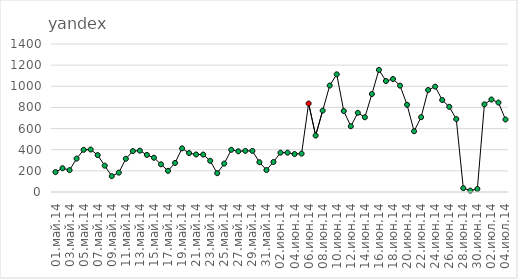
| Category | Итог |
|---|---|
| 01.май.14 | 188 |
| 02.май.14 | 225 |
| 03.май.14 | 207 |
| 04.май.14 | 316 |
| 05.май.14 | 399 |
| 06.май.14 | 402 |
| 07.май.14 | 349 |
| 08.май.14 | 249 |
| 09.май.14 | 150 |
| 10.май.14 | 183 |
| 11.май.14 | 314 |
| 12.май.14 | 387 |
| 13.май.14 | 391 |
| 14.май.14 | 351 |
| 15.май.14 | 324 |
| 16.май.14 | 262 |
| 17.май.14 | 200 |
| 18.май.14 | 275 |
| 19.май.14 | 413 |
| 20.май.14 | 368 |
| 21.май.14 | 355 |
| 22.май.14 | 354 |
| 23.май.14 | 295 |
| 24.май.14 | 178 |
| 25.май.14 | 269 |
| 26.май.14 | 399 |
| 27.май.14 | 385 |
| 28.май.14 | 389 |
| 29.май.14 | 389 |
| 30.май.14 | 282 |
| 31.май.14 | 208 |
| 01.июн.14 | 284 |
| 02.июн.14 | 372 |
| 03.июн.14 | 372 |
| 04.июн.14 | 359 |
| 05.июн.14 | 363 |
| 06.июн.14 | 837 |
| 07.июн.14 | 534 |
| 08.июн.14 | 770 |
| 09.июн.14 | 1007 |
| 10.июн.14 | 1113 |
| 11.июн.14 | 766 |
| 12.июн.14 | 622 |
| 13.июн.14 | 749 |
| 14.июн.14 | 707 |
| 15.июн.14 | 927 |
| 16.июн.14 | 1155 |
| 17.июн.14 | 1050 |
| 18.июн.14 | 1069 |
| 19.июн.14 | 1006 |
| 20.июн.14 | 825 |
| 21.июн.14 | 575 |
| 22.июн.14 | 708 |
| 23.июн.14 | 965 |
| 24.июн.14 | 997 |
| 25.июн.14 | 870 |
| 26.июн.14 | 806 |
| 27.июн.14 | 690 |
| 28.июн.14 | 36 |
| 29.июн.14 | 13 |
| 30.июн.14 | 29 |
| 01.июл.14 | 829 |
| 02.июл.14 | 875 |
| 03.июл.14 | 846 |
| 04.июл.14 | 686 |